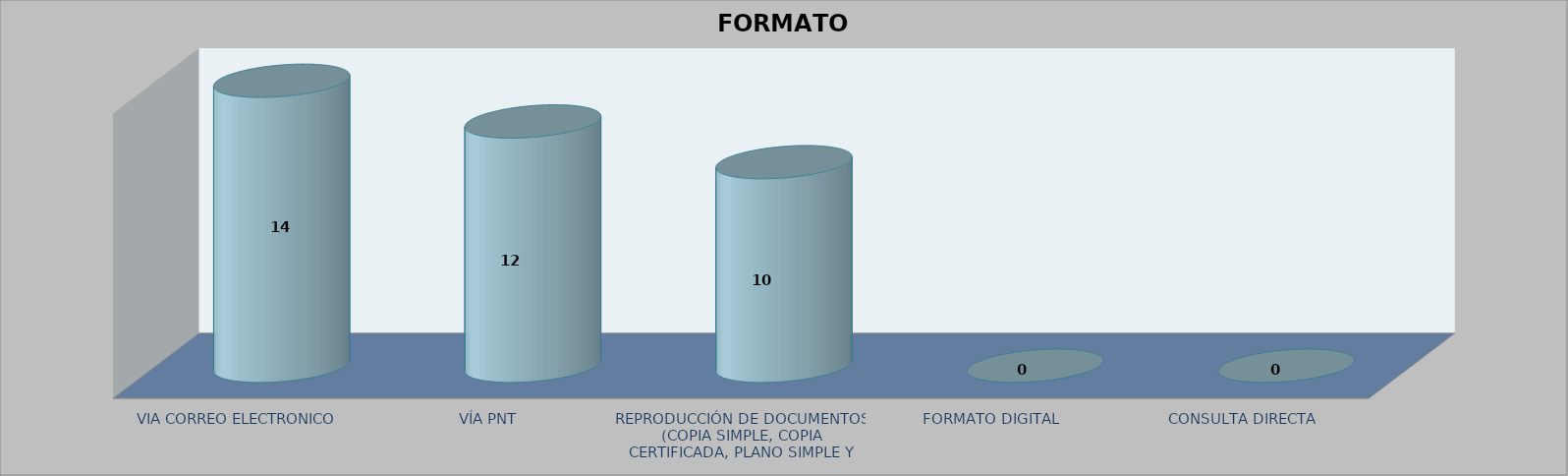
| Category |        FORMATO SOLICITADO | Series 1 | Series 2 |
|---|---|---|---|
| VIA CORREO ELECTRONICO |  |  | 14 |
| VÍA PNT |  |  | 12 |
| REPRODUCCIÓN DE DOCUMENTOS (COPIA SIMPLE, COPIA CERTIFICADA, PLANO SIMPLE Y PLANO CERTIFICADO) |  |  | 10 |
| FORMATO DIGITAL |  |  | 0 |
| CONSULTA DIRECTA |  |  | 0 |